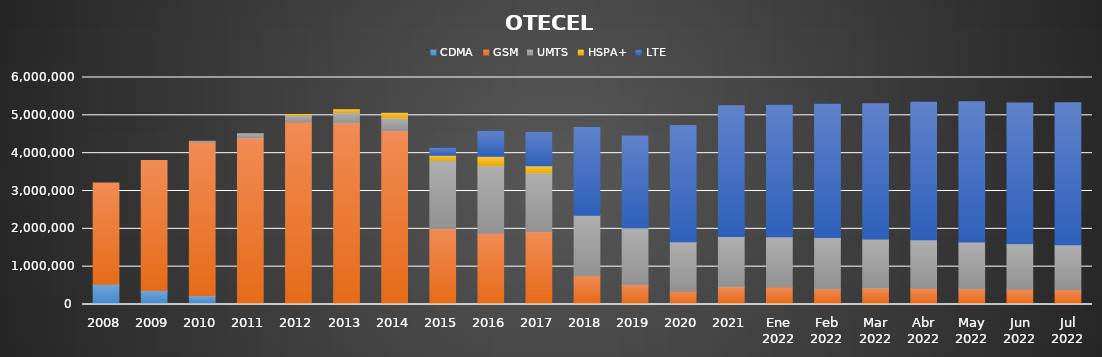
| Category | CDMA | GSM | UMTS | HSPA+ | LTE |
|---|---|---|---|---|---|
| 2008 | 533206 | 2678716 | 0 | 0 | 0 |
| 2009 | 370711 | 3435721 | 0 | 0 | 0 |
| 2010 | 232396 | 4061909 | 20294 | 0 | 0 |
| 2011 | 0 | 4403305 | 110569 | 0 | 0 |
| 2012 | 0 | 4823675 | 174375 | 21636 | 0 |
| 2013 | 0 | 4797632 | 272871 | 77805 | 0 |
| 2014 | 0 | 4589205 | 341647 | 124793 | 0 |
| 2015 | 0 | 2002436 | 1805322 | 136952 | 189988 |
| 2016 | 0 | 1881781 | 1787014 | 248541 | 662756 |
| 2017 | 0 | 1924184.634 | 1552693.066 | 187515.199 | 884631.101 |
| 2018 | 0 | 765658.891 | 1596404.415 | 0 | 2317582.694 |
| 2019 | 0 | 525011.505 | 1498097.705 | 0 | 2433246.79 |
| 2020 | 0 | 348601.621 | 1305745.099 | 0 | 3075378.28 |
| 2021 | 0 | 463116 | 1335075 | 0 | 3456277 |
| Ene 2022 | 0 | 461271.915 | 1324789.367 | 0 | 3486728.718 |
| Feb 2022 | 0 | 419568.449 | 1353562.987 | 0 | 3524816.564 |
| Mar 2022 | 0 | 438224.686 | 1291201.748 | 0 | 3579803.566 |
| Abr 2022 | 0 | 431954.615 | 1274369.387 | 0 | 3643464.999 |
| May 2022 | 0 | 416835.41 | 1233843.984 | 0 | 3707652.607 |
| Jun 2022 | 0 | 404442.897 | 1201100.892 | 0 | 3721062.21 |
| Jul 2022 | 0 | 398450.905 | 1177412.14 | 0 | 3758364.955 |